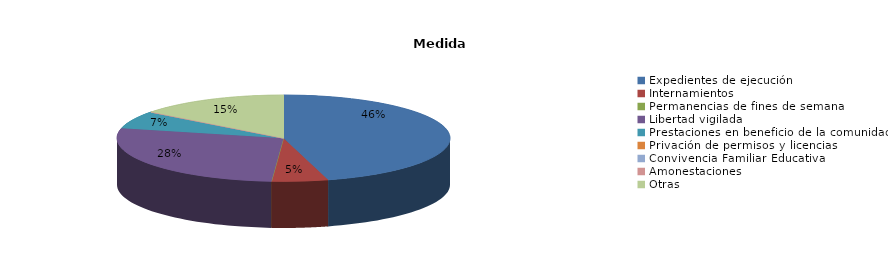
| Category | Series 0 |
|---|---|
| Expedientes de ejecución | 159 |
| Internamientos | 19 |
| Permanencias de fines de semana | 0 |
| Libertad vigilada | 96 |
| Prestaciones en beneficio de la comunidad | 23 |
| Privación de permisos y licencias | 0 |
| Convivencia Familiar Educativa | 0 |
| Amonestaciones | 0 |
| Otras | 51 |